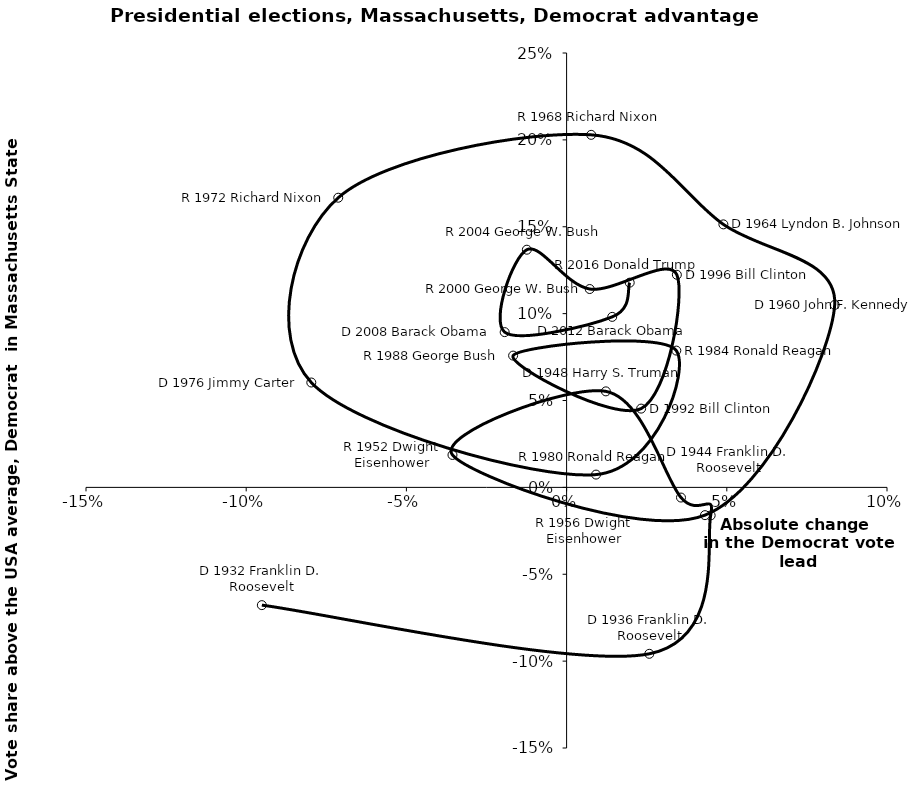
| Category | Series 0 |
|---|---|
| -0.09511628414399045 | -0.068 |
| 0.025814530609959085 | -0.096 |
| 0.0449631583122484 | -0.016 |
| 0.03570151187271417 | -0.006 |
| 0.012258990889314703 | 0.055 |
| -0.03561958841158902 | 0.019 |
| 0.04318770536399877 | -0.016 |
| 0.08367470745250319 | 0.105 |
| 0.048932184159763054 | 0.151 |
| 0.00767276634305028 | 0.203 |
| -0.07127173347628785 | 0.167 |
| -0.0796779391857011 | 0.06 |
| 0.009184999085521312 | 0.007 |
| 0.03423972209260648 | 0.079 |
| -0.01669356313645451 | 0.076 |
| 0.023261974178920175 | 0.045 |
| 0.034413383541153336 | 0.122 |
| 0.0072134443262961145 | 0.114 |
| -0.012403783330240975 | 0.137 |
| -0.01932954795273617 | 0.089 |
| 0.01423700296925326 | 0.098 |
| 0.019699084897112085 | 0.118 |